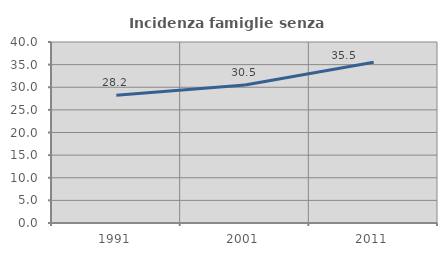
| Category | Incidenza famiglie senza nuclei |
|---|---|
| 1991.0 | 28.239 |
| 2001.0 | 30.488 |
| 2011.0 | 35.518 |